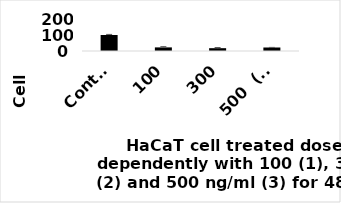
| Category | Series 0 |
|---|---|
| Contrl | 100 |
| 100 | 22.529 |
| 300 | 17.619 |
| 500  (ng/ml) | 21.869 |